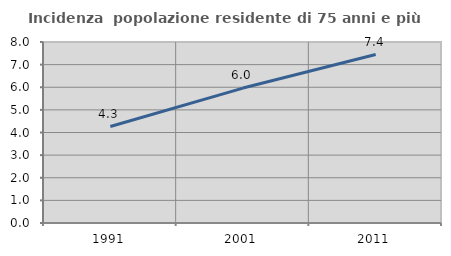
| Category | Incidenza  popolazione residente di 75 anni e più |
|---|---|
| 1991.0 | 4.263 |
| 2001.0 | 5.964 |
| 2011.0 | 7.444 |